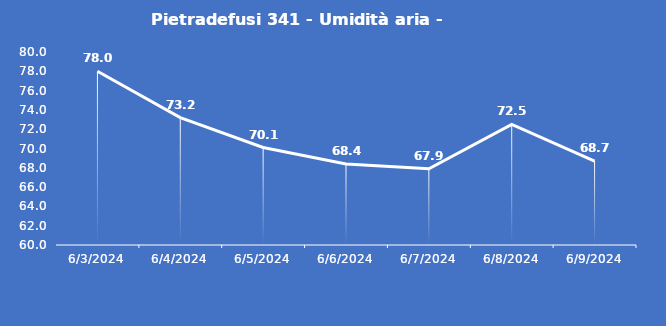
| Category | Pietradefusi 341 - Umidità aria - Grezzo (%) |
|---|---|
| 6/3/24 | 78 |
| 6/4/24 | 73.2 |
| 6/5/24 | 70.1 |
| 6/6/24 | 68.4 |
| 6/7/24 | 67.9 |
| 6/8/24 | 72.5 |
| 6/9/24 | 68.7 |